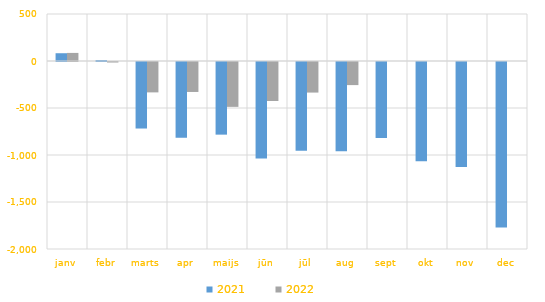
| Category | 2021 | 2022 |
|---|---|---|
| janv | 82687.376 | 85977.566 |
| febr | 10789.506 | -5472.016 |
| marts | -707667.142 | -323198.32 |
| apr | -805934.062 | -318736.122 |
| maijs | -772767.286 | -477330.976 |
| jūn | -1025311.488 | -415131.505 |
| jūl | -945181.179 | -325256.633 |
| aug | -949030.982 | -245672.594 |
| sept | -808331.47 | 0 |
| okt | -1054736.124 | 0 |
| nov | -1116758.714 | 0 |
| dec | -1760352.308 | 0 |